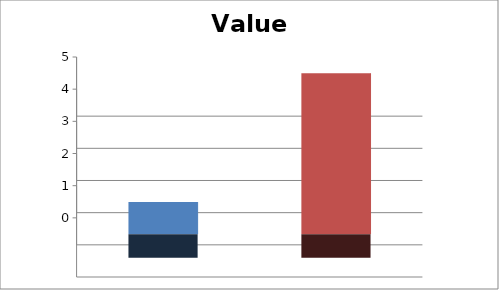
| Category | Value |
|---|---|
| low | 1 |
| high | 5 |